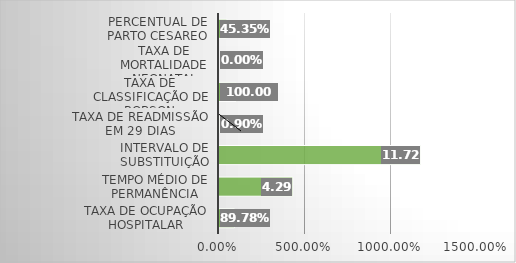
| Category | Series 0 |
|---|---|
| Taxa de Ocupação Hospitalar | 0.898 |
| Tempo Médio de permanência | 4.29 |
| Intervalo de substituição | 11.72 |
| Taxa de readmissão em 29 dias | 0.009 |
| Taxa de classificação de Robson | 1 |
| Taxa de mortalidade neonatal | 0 |
| Percentual de parto cesareo | 0.454 |